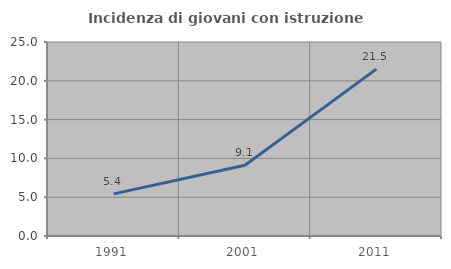
| Category | Incidenza di giovani con istruzione universitaria |
|---|---|
| 1991.0 | 5.426 |
| 2001.0 | 9.111 |
| 2011.0 | 21.504 |